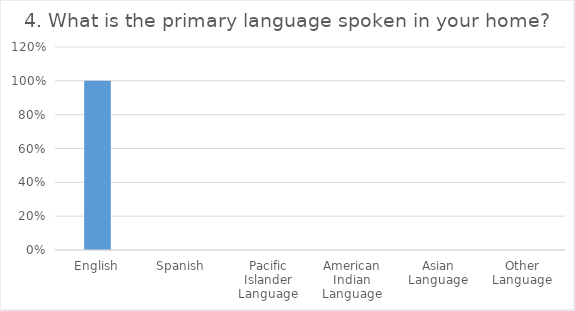
| Category | 4. What is the primary language spoken in your home?  |
|---|---|
| English | 1 |
| Spanish | 0 |
| Pacific Islander Language | 0 |
| American Indian Language | 0 |
| Asian Language | 0 |
| Other Language | 0 |